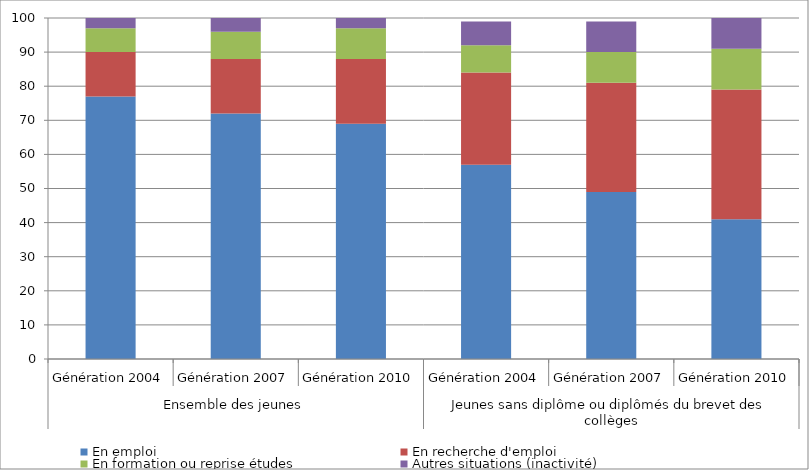
| Category | En emploi | En recherche d'emploi | En formation ou reprise études | Autres situations (inactivité) |
|---|---|---|---|---|
| 0 | 77 | 13 | 7 | 3 |
| 1 | 72 | 16 | 8 | 4 |
| 2 | 69 | 19 | 9 | 4 |
| 3 | 57 | 27 | 8 | 7 |
| 4 | 49 | 32 | 9 | 9 |
| 5 | 41 | 38 | 12 | 9 |